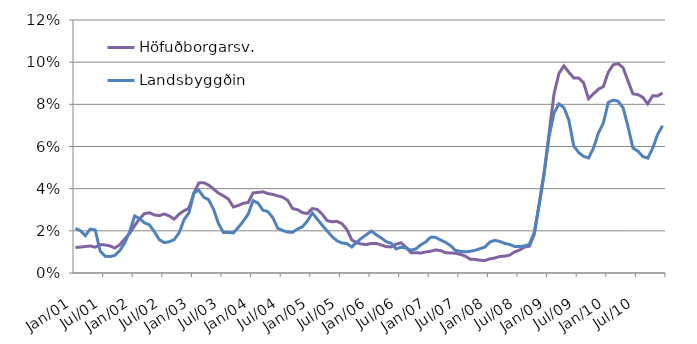
| Category | Höfuðborgarsv. | Landsbyggðin |
|---|---|---|
| 2001-01-01 | 1.211 | 2.119 |
| 2001-02-01 | 1.228 | 2.007 |
| 2001-03-01 | 1.257 | 1.769 |
| 2001-04-01 | 1.282 | 2.083 |
| 2001-05-01 | 1.224 | 2.043 |
| 2001-06-01 | 1.347 | 1.043 |
| 2001-07-01 | 1.33 | 0.798 |
| 2001-08-01 | 1.282 | 0.781 |
| 2001-09-01 | 1.186 | 0.835 |
| 2001-10-01 | 1.347 | 1.069 |
| 2001-11-01 | 1.614 | 1.435 |
| 2001-12-01 | 1.883 | 1.973 |
| 2002-01-01 | 2.251 | 2.708 |
| 2002-02-01 | 2.581 | 2.576 |
| 2002-03-01 | 2.819 | 2.377 |
| 2002-04-01 | 2.856 | 2.283 |
| 2002-05-01 | 2.753 | 1.957 |
| 2002-06-01 | 2.718 | 1.576 |
| 2002-07-01 | 2.801 | 1.444 |
| 2002-08-01 | 2.708 | 1.481 |
| 2002-09-01 | 2.557 | 1.581 |
| 2002-10-01 | 2.793 | 1.905 |
| 2002-11-01 | 2.95 | 2.524 |
| 2002-12-01 | 3.079 | 2.855 |
| 2003-01-01 | 3.778 | 3.798 |
| 2003-02-01 | 4.272 | 3.926 |
| 2003-03-01 | 4.28 | 3.599 |
| 2003-04-01 | 4.171 | 3.473 |
| 2003-05-01 | 3.98 | 3.017 |
| 2003-06-01 | 3.788 | 2.335 |
| 2003-07-01 | 3.657 | 1.919 |
| 2003-08-01 | 3.509 | 1.925 |
| 2003-09-01 | 3.13 | 1.9 |
| 2003-10-01 | 3.202 | 2.156 |
| 2003-11-01 | 3.304 | 2.456 |
| 2003-12-01 | 3.343 | 2.784 |
| 2004-01-01 | 3.8 | 3.435 |
| 2004-02-01 | 3.823 | 3.316 |
| 2004-03-01 | 3.852 | 2.977 |
| 2004-04-01 | 3.767 | 2.912 |
| 2004-05-01 | 3.727 | 2.626 |
| 2004-06-01 | 3.657 | 2.121 |
| 2004-07-01 | 3.596 | 2.014 |
| 2004-08-01 | 3.452 | 1.943 |
| 2004-09-01 | 3.058 | 1.927 |
| 2004-10-01 | 3.004 | 2.086 |
| 2004-11-01 | 2.863 | 2.193 |
| 2004-12-01 | 2.818 | 2.46 |
| 2005-01-01 | 3.057 | 2.849 |
| 2005-02-01 | 3.013 | 2.561 |
| 2005-03-01 | 2.797 | 2.27 |
| 2005-04-01 | 2.487 | 1.998 |
| 2005-05-01 | 2.428 | 1.73 |
| 2005-06-01 | 2.454 | 1.528 |
| 2005-07-01 | 2.341 | 1.425 |
| 2005-08-01 | 2.07 | 1.396 |
| 2005-09-01 | 1.573 | 1.234 |
| 2005-10-01 | 1.432 | 1.459 |
| 2005-11-01 | 1.373 | 1.654 |
| 2005-12-01 | 1.346 | 1.823 |
| 2006-01-01 | 1.405 | 1.987 |
| 2006-02-01 | 1.401 | 1.809 |
| 2006-03-01 | 1.326 | 1.659 |
| 2006-04-01 | 1.243 | 1.486 |
| 2006-05-01 | 1.238 | 1.41 |
| 2006-06-01 | 1.368 | 1.14 |
| 2006-07-01 | 1.434 | 1.22 |
| 2006-08-01 | 1.219 | 1.185 |
| 2006-09-01 | 0.964 | 1.083 |
| 2006-10-01 | 0.962 | 1.142 |
| 2006-11-01 | 0.949 | 1.337 |
| 2006-12-01 | 0.997 | 1.475 |
| 2007-01-01 | 1.031 | 1.695 |
| 2007-02-01 | 1.094 | 1.693 |
| 2007-03-01 | 1.064 | 1.565 |
| 2007-04-01 | 0.964 | 1.455 |
| 2007-05-01 | 0.951 | 1.302 |
| 2007-06-01 | 0.937 | 1.075 |
| 2007-07-01 | 0.884 | 1.028 |
| 2007-08-01 | 0.803 | 1.002 |
| 2007-09-01 | 0.654 | 1.028 |
| 2007-10-01 | 0.643 | 1.076 |
| 2007-11-01 | 0.604 | 1.152 |
| 2007-12-01 | 0.592 | 1.23 |
| 2008-01-01 | 0.672 | 1.469 |
| 2008-02-01 | 0.71 | 1.55 |
| 2008-03-01 | 0.784 | 1.496 |
| 2008-04-01 | 0.797 | 1.405 |
| 2008-05-01 | 0.848 | 1.353 |
| 2008-06-01 | 1.001 | 1.259 |
| 2008-07-01 | 1.085 | 1.256 |
| 2008-08-01 | 1.226 | 1.281 |
| 2008-09-01 | 1.269 | 1.355 |
| 2008-10-01 | 1.835 | 1.923 |
| 2008-11-01 | 3.288 | 3.249 |
| 2008-12-01 | 4.786 | 4.691 |
| 2009-01-01 | 6.612 | 6.468 |
| 2009-02-01 | 8.485 | 7.588 |
| 2009-03-01 | 9.466 | 8.02 |
| 2009-04-01 | 9.824 | 7.848 |
| 2009-05-01 | 9.525 | 7.262 |
| 2009-06-01 | 9.253 | 6.029 |
| 2009-07-01 | 9.252 | 5.714 |
| 2009-08-01 | 9.021 | 5.532 |
| 2009-09-01 | 8.265 | 5.455 |
| 2009-10-01 | 8.498 | 5.926 |
| 2009-11-01 | 8.721 | 6.641 |
| 2009-12-01 | 8.843 | 7.112 |
| 2010-01-01 | 9.527 | 8.089 |
| 2010-02-01 | 9.874 | 8.198 |
| 2010-03-01 | 9.934 | 8.149 |
| 2010-04-01 | 9.734 | 7.836 |
| 2010-05-01 | 9.109 | 6.95 |
| 2010-06-01 | 8.497 | 5.926 |
| 2010-07-01 | 8.464 | 5.782 |
| 2010-08-01 | 8.335 | 5.526 |
| 2010-09-01 | 8.023 | 5.447 |
| 2010-10-01 | 8.402 | 5.921 |
| 2010-11-01 | 8.399 | 6.57 |
| 2010-12-01 | 8.537 | 6.986 |